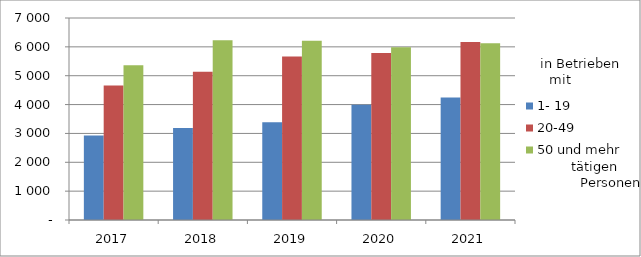
| Category | 1- 19 | 20-49 | 50 und mehr |
|---|---|---|---|
| 2017.0 | 2930 | 4661 | 5360 |
| 2018.0 | 3184 | 5139 | 6227 |
| 2019.0 | 3387 | 5663 | 6215 |
| 2020.0 | 3997 | 5786 | 5986 |
| 2021.0 | 4247 | 6166 | 6127 |